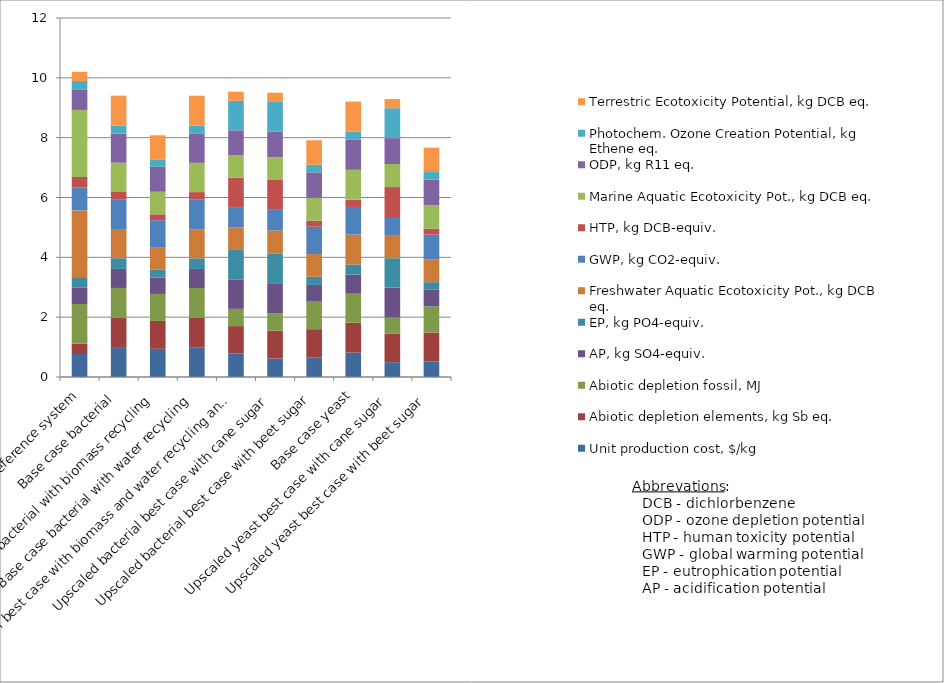
| Category | Unit production cost, $/kg | Abiotic depletion elements, kg Sb eq. | Abiotic depletion fossil, MJ | AP, kg SO4-equiv. | EP, kg PO4-equiv. | Freshwater Aquatic Ecotoxicity Pot., kg DCB eq. | GWP, kg CO2-equiv. | HTP, kg DCB-equiv. | Marine Aquatic Ecotoxicity Pot., kg DCB eq. | ODP, kg R11 eq. | Photochem. Ozone Creation Potential, kg Ethene eq. | Terrestric Ecotoxicity Potential, kg DCB eq. |
|---|---|---|---|---|---|---|---|---|---|---|---|---|
| Reference system | 0.768 | 0.351 | 1.322 | 0.542 | 0.355 | 2.231 | 0.763 | 0.356 | 2.239 | 0.67 | 0.296 | 0.309 |
| Base case bacterial | 1 | 0.979 | 0.997 | 0.637 | 0.358 | 0.974 | 0.999 | 0.239 | 0.979 | 0.967 | 0.278 | 0.998 |
| Base case bacterial with biomass recycling | 0.941 | 0.933 | 0.902 | 0.549 | 0.272 | 0.744 | 0.898 | 0.198 | 0.753 | 0.835 | 0.248 | 0.804 |
| Base case bacterial with water recycling | 0.995 | 0.98 | 1 | 0.638 | 0.355 | 0.973 | 1 | 0.239 | 0.979 | 0.967 | 0.278 | 0.998 |
| Bacterial best case with biomass and water recycling and cane sugar | 0.783 | 0.918 | 0.577 | 0.985 | 0.985 | 0.753 | 0.679 | 0.982 | 0.751 | 0.835 | 0.984 | 0.304 |
| Upscaled bacterial best case with cane sugar | 0.617 | 0.932 | 0.585 | 1 | 1 | 0.764 | 0.69 | 0.997 | 0.763 | 0.848 | 0.999 | 0.309 |
| Upscaled bacterial best case with beet sugar | 0.648 | 0.951 | 0.919 | 0.559 | 0.274 | 0.757 | 0.914 | 0.202 | 0.766 | 0.851 | 0.253 | 0.819 |
| Base case yeast | 0.814 | 1 | 0.969 | 0.638 | 0.341 | 1 | 0.922 | 0.242 | 1 | 1 | 0.279 | 1 |
| Upscaled yeast best case with cane sugar | 0.495 | 0.951 | 0.543 | 0.997 | 0.983 | 0.778 | 0.6 | 1 | 0.771 | 0.866 | 1 | 0.306 |
| Upscaled yeast best case with beet sugar | 0.521 | 0.966 | 0.875 | 0.553 | 0.254 | 0.769 | 0.822 | 0.202 | 0.772 | 0.866 | 0.25 | 0.815 |